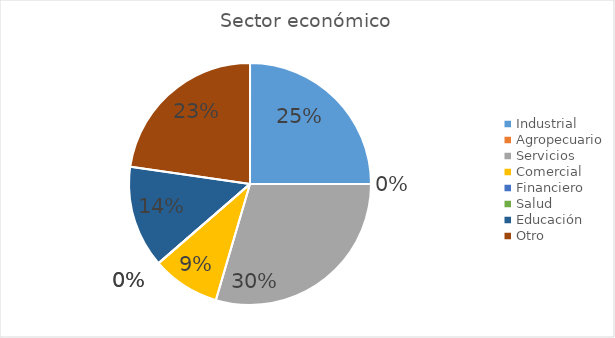
| Category | Series 0 |
|---|---|
| Industrial | 0.25 |
| Agropecuario | 0 |
| Servicios | 0.295 |
| Comercial | 0.091 |
| Financiero | 0 |
| Salud | 0 |
| Educación | 0.136 |
| Otro | 0.227 |